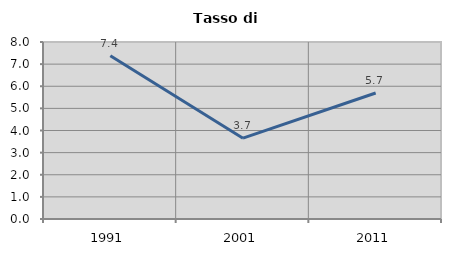
| Category | Tasso di disoccupazione   |
|---|---|
| 1991.0 | 7.375 |
| 2001.0 | 3.653 |
| 2011.0 | 5.696 |